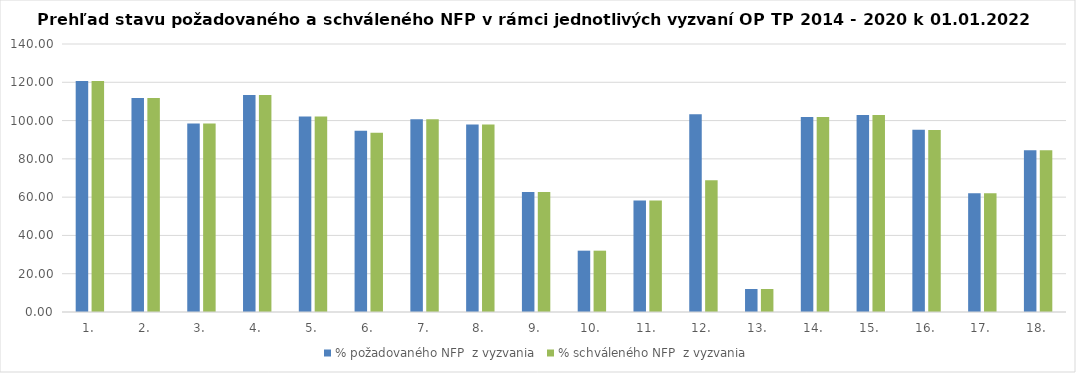
| Category | % požadovaného NFP  z vyzvania | % schváleného NFP  z vyzvania |
|---|---|---|
| 1. | 120.662 | 120.662 |
| 2. | 111.83 | 111.83 |
| 3. | 98.465 | 98.465 |
| 4. | 113.295 | 113.295 |
| 5. | 102.19 | 102.19 |
| 6. | 94.643 | 93.673 |
| 7. | 100.637 | 100.637 |
| 8. | 97.989 | 97.989 |
| 9. | 62.721 | 62.721 |
| 10. | 32.038 | 32.038 |
| 11. | 58.283 | 58.283 |
| 12. | 103.242 | 68.88 |
| 13. | 12.008 | 12.008 |
| 14. | 101.839 | 101.839 |
| 15. | 102.872 | 102.872 |
| 16. | 95.185 | 95.126 |
| 17. | 61.969 | 61.969 |
| 18. | 84.514 | 84.514 |